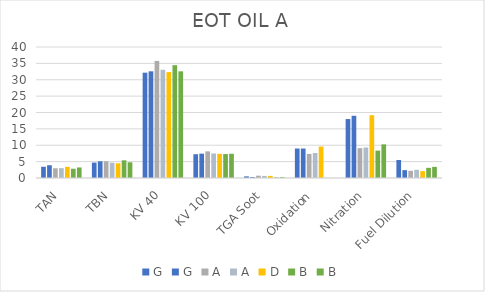
| Category | G | A | D | B |
|---|---|---|---|---|
| TAN | 3.9 | 3.01 | 3.4 | 3.22 |
| TBN | 5.1 | 4.67 | 4.5 | 4.8 |
| KV 40 | 32.58 | 33.034 | 32.34 | 32.57 |
| KV 100 | 7.44 | 7.486 | 7.38 | 7.4 |
| TGA Soot | 0.3 | 0.629 | 0.643 | 0.24 |
| Oxidation | 9 | 7.64 | 9.6 | 0 |
| Nitration | 19 | 9.31 | 19.18 | 10.27 |
| Fuel Dilution | 2.4 | 2.5 | 2.1 | 3.4 |